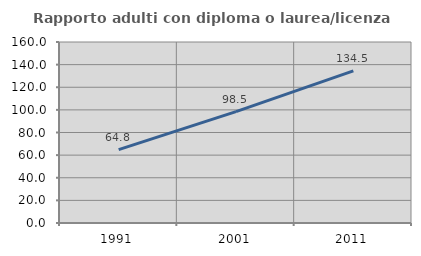
| Category | Rapporto adulti con diploma o laurea/licenza media  |
|---|---|
| 1991.0 | 64.85 |
| 2001.0 | 98.498 |
| 2011.0 | 134.468 |